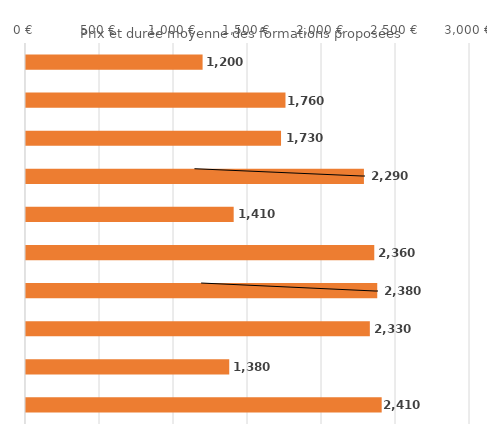
| Category | Series 0 |
|---|---|
| Permis de conduire catégorie B | 1200 |
| Bilan de compétences | 1760 |
| Accompagnement VAE | 1730 |
| Test TOEIC (Test of English for International Communication) | 2290 |
| Actions de formation dispensées aux créateurs et repreneurs d'entreprise | 1410 |
| Certification CLOE anglais | 2360 |
| Certification CLOE espagnol | 2380 |
| Certificat Linguaskill from Cambridge - anglais | 2330 |
| TOSA Excel | 1380 |
| Certification CLOE italien | 2410 |